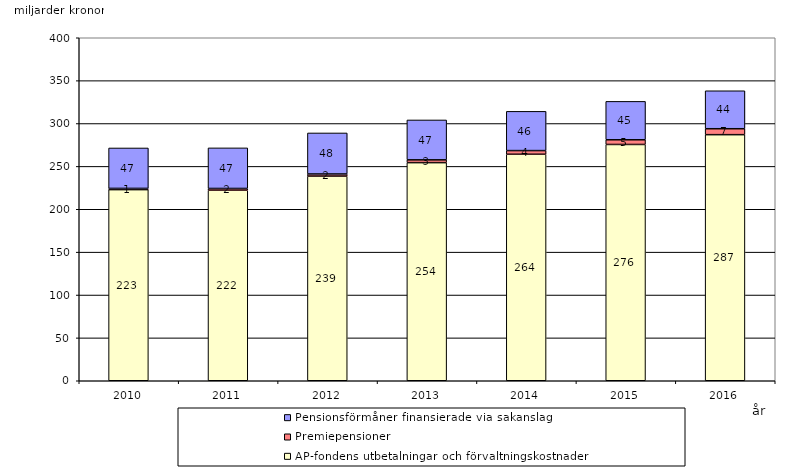
| Category | AP-fondens utbetalningar och förvaltningskostnader | Premiepensioner | Pensionsförmåner finansierade via sakanslag |
|---|---|---|---|
| 2010.0 | 222.897 | 1.412 | 47.171 |
| 2011.0 | 222.224 | 2.022 | 47.319 |
| 2012.0 | 238.684 | 2.448 | 47.86 |
| 2013.0 | 254.37 | 3.247 | 46.533 |
| 2014.0 | 264.158 | 4.264 | 45.759 |
| 2015.0 | 275.557 | 5.467 | 44.789 |
| 2016.0 | 286.981 | 6.929 | 44.265 |